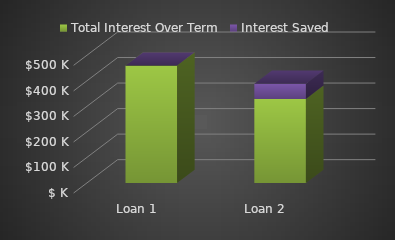
| Category | Total Interest Over Term | Interest Saved |
|---|---|---|
| 0 | 459999.297 | 0 |
| 1 | 329252.236 | 59278.622 |